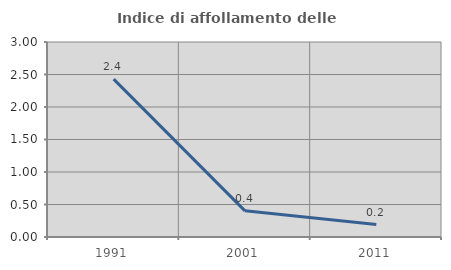
| Category | Indice di affollamento delle abitazioni  |
|---|---|
| 1991.0 | 2.428 |
| 2001.0 | 0.402 |
| 2011.0 | 0.191 |